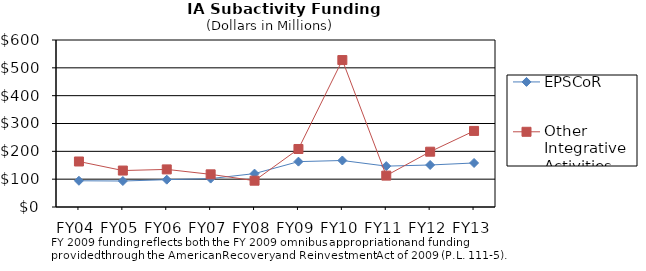
| Category | EPSCoR | Other Integrative Activities |
|---|---|---|
| FY04 | 94.24 | 163.52 |
| FY05 | 93.35 | 130.92 |
| FY06 | 98.22 | 135.08 |
| FY07 | 102.11 | 117.34 |
| FY08 | 120 | 94.48 |
| FY09 | 163 | 208.43 |
| FY10 | 167.11 | 527.93 |
| FY11 | 146.82 | 112.78 |
| FY12 | 150.9 | 198.69 |
| FY13 | 158.19 | 273.33 |